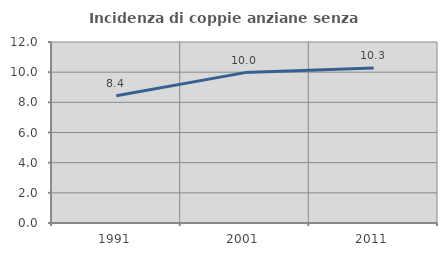
| Category | Incidenza di coppie anziane senza figli  |
|---|---|
| 1991.0 | 8.441 |
| 2001.0 | 9.97 |
| 2011.0 | 10.27 |